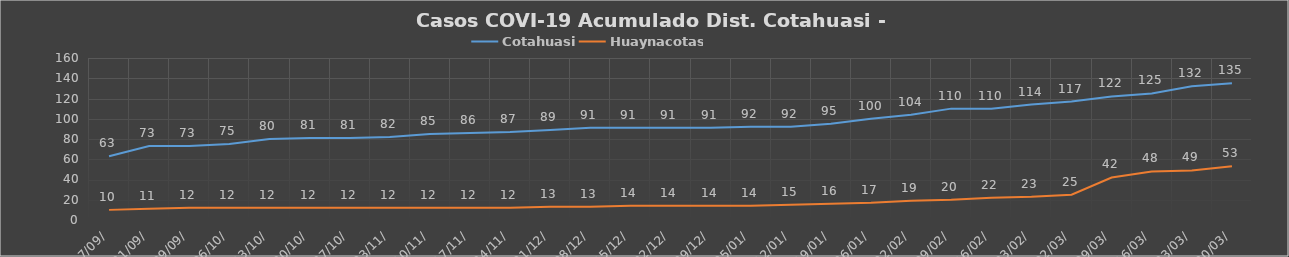
| Category | Cotahuasi | Huaynacotas |
|---|---|---|
| 7/09/ | 63 | 10 |
| 21/09/ | 73 | 11 |
| 29/09/ | 73 | 12 |
| 06/10/ | 75 | 12 |
| 13/10/ | 80 | 12 |
| 20/10/ | 81 | 12 |
| 27/10/ | 81 | 12 |
| 03/11/ | 82 | 12 |
| 10/11/ | 85 | 12 |
| 17/11/ | 86 | 12 |
| 24/11/ | 87 | 12 |
| 01/12/ | 89 | 13 |
| 08/12/ | 91 | 13 |
| 15/12/ | 91 | 14 |
| 22/12/ | 91 | 14 |
| 29/12/ | 91 | 14 |
| 05/01/ | 92 | 14 |
| 12/01/ | 92 | 15 |
| 19/01/ | 95 | 16 |
| 26/01/ | 100 | 17 |
| 02/02/ | 104 | 19 |
| 09/02/ | 110 | 20 |
| 16/02/ | 110 | 22 |
| 23/02/ | 114 | 23 |
| 02/03/ | 117 | 25 |
| 09/03/ | 122 | 42 |
| 16/03/ | 125 | 48 |
| 23/03/ | 132 | 49 |
| 30/03/ | 135 | 53 |